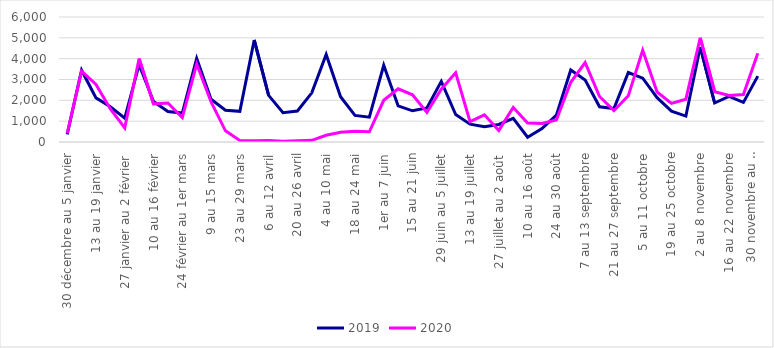
| Category | 2019 | 2020 |
|---|---|---|
| 30 décembre au 5 janvier | 369 | 411 |
| 6 au 12 janvier | 3446 | 3400 |
| 13 au 19 janvier | 2117 | 2765 |
| 20 au 26 janvier | 1689 | 1587 |
| 27 janvier au 2 février | 1140 | 677 |
| 3 au 9 février | 3711 | 4001 |
| 10 au 16 février | 1947 | 1832 |
| 17 au 23 février | 1464 | 1873 |
| 24 février au 1er mars | 1389 | 1176 |
| 2 au 8 mars | 4019 | 3741 |
| 9 au 15 mars | 2049 | 1926 |
| 16 au 22 mars | 1525 | 536 |
| 23 au 29 mars | 1473 | 74 |
| 30 mars au 5 avril | 4896 | 61 |
| 6 au 12 avril | 2237 | 69 |
| 13 au 19 avril | 1410 | 40 |
| 20 au 26 avril | 1489 | 59 |
| 27 avril au 3 mai | 2361 | 79 |
| 4 au 10 mai | 4200 | 324 |
| 11 au 17 mai | 2172 | 463 |
| 18 au 24 mai | 1275 | 517 |
| 25 au 31 mai | 1190 | 488 |
| 1er au 7 juin | 3685 | 2003 |
| 8 au 14 juin | 1736 | 2554 |
| 15 au 21 juin | 1497 | 2264 |
| 22 au 28 juin | 1634 | 1420 |
| 29 juin au 5 juillet | 2913 | 2532 |
| 6 au 12 juillet | 1321 | 3318 |
| 13 au 19 juillet | 858 | 974 |
| 20 au 26 juillet | 730 | 1305 |
| 27 juillet au 2 août | 843 | 556 |
| 3 au 9 août | 1137 | 1657 |
| 10 au 16 août | 229 | 909 |
| 17 au 23 août | 641 | 890 |
| 24 au 30 août | 1291 | 1057 |
| 31 août au 6 septembre | 3457 | 2867 |
| 7 au 13 septembre | 2973 | 3812 |
| 14 au 20 septembre | 1692 | 2185 |
| 21 au 27 septembre | 1603 | 1504 |
| 28 septembre au 4 octobre | 3335 | 2222 |
| 5 au 11 octobre | 3066 | 4402 |
| 12 au 18 octobre | 2128 | 2399 |
| 19 au 25 octobre | 1479 | 1855 |
| 26 octobre au 1er novembre | 1245 | 2054 |
| 2 au 8 novembre | 4560 | 5003 |
| 9 au 15 novembre | 1872 | 2414 |
| 16 au 22 novembre | 2185 | 2234 |
| 23 au 29 novembre | 1903 | 2281 |
| 30 novembre au 6 décembre | 3162 | 4256 |